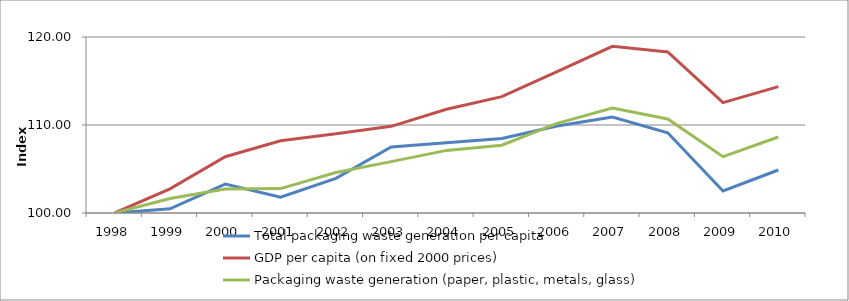
| Category | Total packaging waste generation per capita  | GDP per capita (on fixed 2000 prices) | Packaging waste generation (paper, plastic, metals, glass) |
|---|---|---|---|
| 1998.0 | 100 | 100 | 100 |
| 1999.0 | 100.477 | 102.738 | 101.653 |
| 2000.0 | 103.278 | 106.399 | 102.732 |
| 2001.0 | 101.788 | 108.208 | 102.776 |
| 2002.0 | 103.933 | 109.017 | 104.6 |
| 2003.0 | 107.509 | 109.847 | 105.836 |
| 2004.0 | 107.986 | 111.785 | 107.114 |
| 2005.0 | 108.462 | 113.225 | 107.699 |
| 2006.0 | 109.893 | 116.074 | 110.19 |
| 2007.0 | 110.906 | 118.939 | 111.939 |
| 2008.0 | 109.118 | 118.302 | 110.679 |
| 2009.0 | 102.503 | 112.535 | 106.398 |
| 2010.0 | 104.887 | 114.365 | 108.635 |